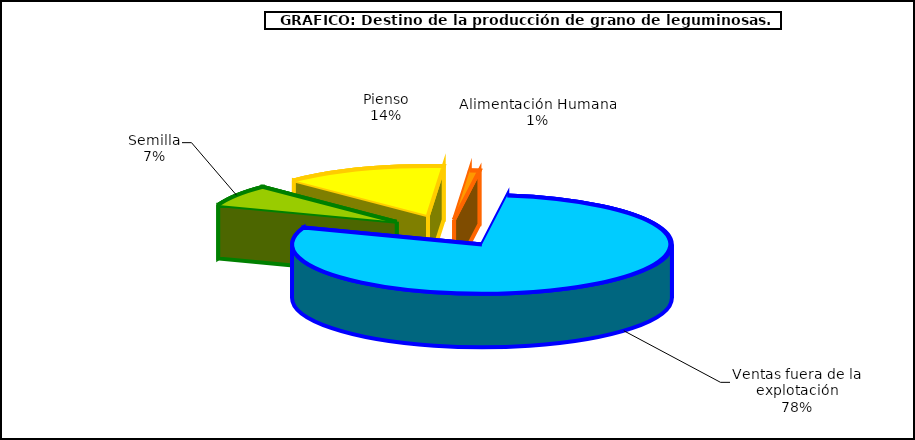
| Category | Series 0 |
|---|---|
| 0 | 31379 |
| 1 | 62151 |
| 2 | 3658 |
| 3 | 353319 |